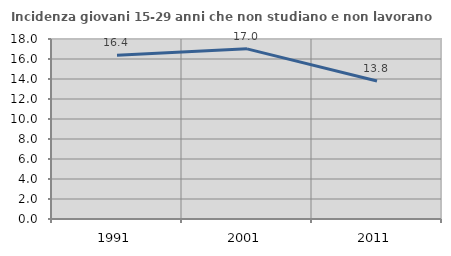
| Category | Incidenza giovani 15-29 anni che non studiano e non lavorano  |
|---|---|
| 1991.0 | 16.379 |
| 2001.0 | 17.015 |
| 2011.0 | 13.793 |